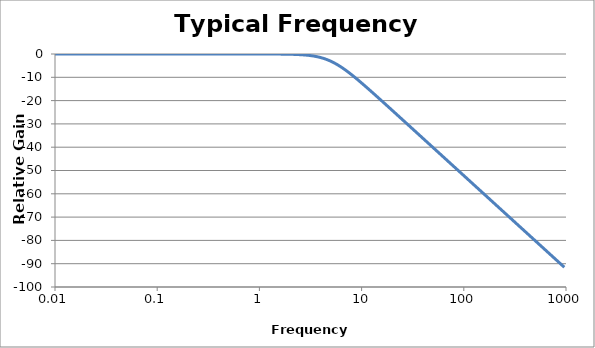
| Category | Relative Gain (dB) |
|---|---|
| 0.01 | 0 |
| 0.010391220000000001 | 0 |
| 0.01079775 | 0 |
| 0.01122018 | 0 |
| 0.01165914 | 0 |
| 0.01211528 | 0 |
| 0.01258925 | 0 |
| 0.013081770000000001 | 0 |
| 0.01359356 | 0 |
| 0.01412538 | 0 |
| 0.01467799 | 0 |
| 0.01525223 | 0 |
| 0.01584893 | 0 |
| 0.016468979999999998 | 0 |
| 0.017113279999999998 | 0 |
| 0.01778279 | 0 |
| 0.018478500000000002 | 0 |
| 0.01920142 | 0 |
| 0.01995262 | 0 |
| 0.02073322 | 0 |
| 0.02154435 | 0 |
| 0.02238721 | 0 |
| 0.02326305 | 0 |
| 0.02417315 | 0 |
| 0.02511886 | 0 |
| 0.026101569999999998 | 0 |
| 0.02712273 | 0 |
| 0.02818383 | 0 |
| 0.02928645 | 0 |
| 0.030432200000000003 | 0 |
| 0.031622779999999996 | 0 |
| 0.032859929999999996 | 0 |
| 0.03414549 | 0 |
| 0.03548134 | 0 |
| 0.03686945 | 0 |
| 0.03831187 | 0 |
| 0.03981072 | 0 |
| 0.0413682 | 0 |
| 0.04298662 | 0 |
| 0.04466836 | 0 |
| 0.046415889999999994 | 0 |
| 0.04823178 | 0 |
| 0.050118720000000005 | 0 |
| 0.05207948 | 0 |
| 0.054116950000000004 | 0 |
| 0.05623413 | 0 |
| 0.05843414 | 0 |
| 0.06072022 | 0 |
| 0.06309573 | 0 |
| 0.06556418 | 0 |
| 0.06812921 | 0 |
| 0.07079458 | 0 |
| 0.07356423 | 0 |
| 0.07644223 | 0 |
| 0.07943282 | 0 |
| 0.08254042 | 0 |
| 0.08576958999999999 | 0 |
| 0.08912509 | 0 |
| 0.09261187 | 0 |
| 0.09623506000000001 | 0 |
| 0.1 | 0 |
| 0.10391223 | 0 |
| 0.10797752 | 0 |
| 0.11220184999999999 | 0 |
| 0.11659144 | 0 |
| 0.12115277 | 0 |
| 0.12589254 | 0 |
| 0.13081774999999998 | 0 |
| 0.13593564 | 0 |
| 0.14125374999999998 | 0 |
| 0.14677993 | 0 |
| 0.1525223 | 0 |
| 0.15848932 | 0 |
| 0.16468978999999997 | 0 |
| 0.17113283 | 0 |
| 0.17782794000000002 | 0 |
| 0.18478498 | 0 |
| 0.19201419 | 0 |
| 0.19952623 | 0 |
| 0.20733216 | 0 |
| 0.21544347 | 0 |
| 0.22387210999999999 | 0 |
| 0.23263050999999998 | 0 |
| 0.24173155 | 0 |
| 0.25118864 | 0 |
| 0.26101572 | 0 |
| 0.27122726 | 0 |
| 0.28183829 | 0 |
| 0.29286446 | 0 |
| 0.30432199000000004 | 0 |
| 0.31622777 | 0 |
| 0.32859932 | 0 |
| 0.34145488999999996 | 0 |
| 0.35481339 | 0 |
| 0.36869451 | 0 |
| 0.38311868 | 0 |
| 0.39810717 | -0.001 |
| 0.41368204 | -0.001 |
| 0.42986622999999996 | -0.001 |
| 0.44668358999999996 | -0.001 |
| 0.46415888 | -0.001 |
| 0.48231785000000005 | -0.001 |
| 0.50118723 | -0.001 |
| 0.52079483 | -0.001 |
| 0.54116953 | -0.001 |
| 0.56234133 | -0.001 |
| 0.58434141 | -0.002 |
| 0.6072021999999999 | -0.002 |
| 0.63095734 | -0.002 |
| 0.65564185 | -0.002 |
| 0.6812920699999999 | -0.003 |
| 0.70794578 | -0.003 |
| 0.7356422499999999 | -0.003 |
| 0.7644222700000001 | -0.004 |
| 0.79432823 | -0.004 |
| 0.82540419 | -0.005 |
| 0.8576959000000001 | -0.006 |
| 0.89125094 | -0.006 |
| 0.92611873 | -0.007 |
| 0.96235063 | -0.008 |
| 1.0 | -0.009 |
| 1.0391223 | -0.011 |
| 1.0797751599999998 | -0.012 |
| 1.1220184500000001 | -0.014 |
| 1.1659144 | -0.016 |
| 1.21152766 | -0.019 |
| 1.25892541 | -0.022 |
| 1.3081774700000002 | -0.025 |
| 1.3593563899999999 | -0.029 |
| 1.41253754 | -0.033 |
| 1.46779927 | -0.038 |
| 1.52522296 | -0.044 |
| 1.58489319 | -0.051 |
| 1.64689787 | -0.059 |
| 1.7113283 | -0.068 |
| 1.7782794100000001 | -0.078 |
| 1.8478497999999999 | -0.09 |
| 1.92014194 | -0.105 |
| 1.99526231 | -0.121 |
| 2.07332157 | -0.14 |
| 2.15443469 | -0.162 |
| 2.23872114 | -0.188 |
| 2.32630507 | -0.217 |
| 2.41731548 | -0.251 |
| 2.51188643 | -0.29 |
| 2.61015722 | -0.335 |
| 2.71227258 | -0.388 |
| 2.8183829300000003 | -0.447 |
| 2.9286445600000004 | -0.516 |
| 3.04321989 | -0.594 |
| 3.16227766 | -0.684 |
| 3.28599325 | -0.786 |
| 3.41454887 | -0.902 |
| 3.54813389 | -1.034 |
| 3.68694506 | -1.182 |
| 3.83118685 | -1.348 |
| 3.98107171 | -1.535 |
| 4.1368203999999995 | -1.742 |
| 4.29866235 | -1.972 |
| 4.46683592 | -2.225 |
| 4.64158883 | -2.502 |
| 4.823178479999999 | -2.805 |
| 5.01187234 | -3.132 |
| 5.20794833 | -3.486 |
| 5.41169527 | -3.864 |
| 5.62341325 | -4.267 |
| 5.84341413 | -4.694 |
| 6.07202196 | -5.144 |
| 6.30957344 | -5.615 |
| 6.55641849 | -6.107 |
| 6.81292069 | -6.617 |
| 7.07945784 | -7.145 |
| 7.35642254 | -7.69 |
| 7.64422274 | -8.248 |
| 7.9432823500000005 | -8.82 |
| 8.25404185 | -9.403 |
| 8.57695899 | -9.997 |
| 8.91250938 | -10.6 |
| 9.26118728 | -11.212 |
| 9.623506260000001 | -11.83 |
| 10.0 | -12.455 |
| 10.391223040000002 | -13.086 |
| 10.79775162 | -13.721 |
| 11.22018454 | -14.36 |
| 11.65914401 | -15.004 |
| 12.115276589999999 | -15.65 |
| 12.58925412 | -16.299 |
| 13.08177474 | -16.951 |
| 13.59356391 | -17.604 |
| 14.12537545 | -18.26 |
| 14.67799268 | -18.917 |
| 15.252229569999999 | -19.575 |
| 15.84893192 | -20.234 |
| 16.46897865 | -20.895 |
| 17.11328304 | -21.556 |
| 17.7827941 | -22.218 |
| 18.47849797 | -22.881 |
| 19.201419389999998 | -23.544 |
| 19.95262315 | -24.208 |
| 20.73321573 | -24.872 |
| 21.5443469 | -25.536 |
| 22.38721139 | -26.201 |
| 23.263050670000002 | -26.866 |
| 24.17315481 | -27.531 |
| 25.11886432 | -28.196 |
| 26.10157216 | -28.862 |
| 27.12272579 | -29.528 |
| 28.18382931 | -30.194 |
| 29.28644565 | -30.859 |
| 30.43219887 | -31.526 |
| 31.6227766 | -32.192 |
| 32.859932480000005 | -32.858 |
| 34.14548874 | -33.524 |
| 35.48133892 | -34.19 |
| 36.86945065 | -34.857 |
| 38.311868499999996 | -35.523 |
| 39.81071706 | -36.19 |
| 41.36820402 | -36.856 |
| 42.98662347 | -37.523 |
| 44.66835922 | -38.189 |
| 46.415888339999995 | -38.856 |
| 48.23178482 | -39.522 |
| 50.118723360000004 | -40.189 |
| 52.07948329 | -40.855 |
| 54.11695265 | -41.522 |
| 56.234132519999996 | -42.188 |
| 58.434141340000004 | -42.855 |
| 60.72021957 | -43.522 |
| 63.09573445 | -44.188 |
| 65.56418494 | -44.855 |
| 68.12920691 | -45.521 |
| 70.79457844 | -46.188 |
| 73.56422545 | -46.855 |
| 76.44222743 | -47.521 |
| 79.43282347 | -48.188 |
| 82.54041853 | -48.855 |
| 85.76958986 | -49.521 |
| 89.12509381000001 | -50.188 |
| 92.61187281 | -50.855 |
| 96.23506264000001 | -51.521 |
| 100.0 | -52.188 |
| 103.91223038 | -52.854 |
| 107.97751622999999 | -53.521 |
| 112.20184543 | -54.188 |
| 116.59144012 | -54.854 |
| 121.15276586 | -55.521 |
| 125.89254118 | -56.188 |
| 130.81774743 | -56.854 |
| 135.93563909000002 | -57.521 |
| 141.25375446 | -58.188 |
| 146.77992676 | -58.854 |
| 152.52229565 | -59.521 |
| 158.48931925 | -60.188 |
| 164.68978654999998 | -60.854 |
| 171.13283042 | -61.521 |
| 177.82794099999998 | -62.188 |
| 184.78497974 | -62.854 |
| 192.01419386 | -63.521 |
| 199.5262315 | -64.188 |
| 207.33215735 | -64.854 |
| 215.44346900000002 | -65.521 |
| 223.87211386 | -66.188 |
| 232.63050672 | -66.854 |
| 241.73154808 | -67.521 |
| 251.18864315 | -68.188 |
| 261.01572157 | -68.854 |
| 271.22725793 | -69.521 |
| 281.83829313 | -70.188 |
| 292.86445646000004 | -70.854 |
| 304.32198871 | -71.521 |
| 316.22776602 | -72.188 |
| 328.59932476 | -72.854 |
| 341.45488737999995 | -73.521 |
| 354.81338923 | -74.188 |
| 368.69450645 | -74.854 |
| 383.11868496 | -75.521 |
| 398.10717055 | -76.188 |
| 413.68204024 | -76.854 |
| 429.86623471 | -77.521 |
| 446.68359215 | -78.188 |
| 464.15888336 | -78.854 |
| 482.31784822 | -79.521 |
| 501.18723363 | -80.188 |
| 520.79483286 | -80.854 |
| 541.16952655 | -81.521 |
| 562.34132519 | -82.188 |
| 584.3414133699999 | -82.854 |
| 607.2021956899999 | -83.521 |
| 630.95734448 | -84.188 |
| 655.64184942 | -84.854 |
| 681.29206906 | -85.521 |
| 707.94578438 | -86.188 |
| 735.64225446 | -86.854 |
| 764.42227425 | -87.521 |
| 794.32823472 | -88.188 |
| 825.40418527 | -88.854 |
| 857.69589859 | -89.521 |
| 891.25093813 | -90.188 |
| 926.1187281299999 | -90.854 |
| 962.3506263999999 | -91.521 |